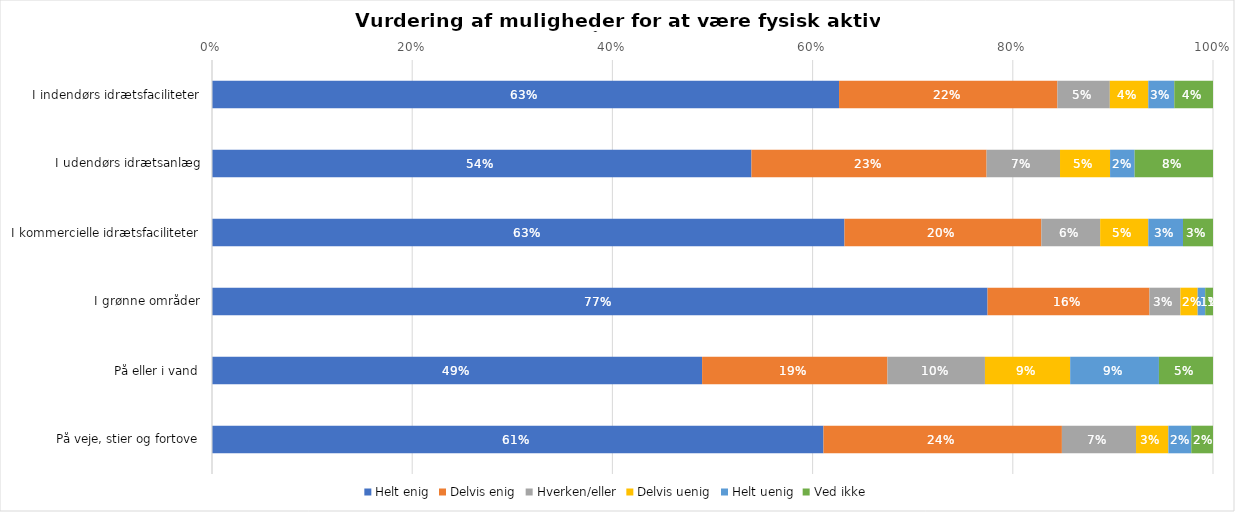
| Category | Helt enig | Delvis enig | Hverken/eller | Delvis uenig | Helt uenig | Ved ikke |
|---|---|---|---|---|---|---|
| I indendørs idrætsfaciliteter | 0.626 | 0.218 | 0.052 | 0.038 | 0.026 | 0.039 |
| I udendørs idrætsanlæg | 0.539 | 0.235 | 0.073 | 0.05 | 0.025 | 0.078 |
| I kommercielle idrætsfaciliteter | 0.632 | 0.197 | 0.059 | 0.048 | 0.035 | 0.03 |
| I grønne områder | 0.775 | 0.162 | 0.031 | 0.017 | 0.008 | 0.008 |
| På eller i vand | 0.49 | 0.185 | 0.097 | 0.085 | 0.089 | 0.054 |
| På veje, stier og fortove | 0.611 | 0.238 | 0.074 | 0.032 | 0.023 | 0.022 |